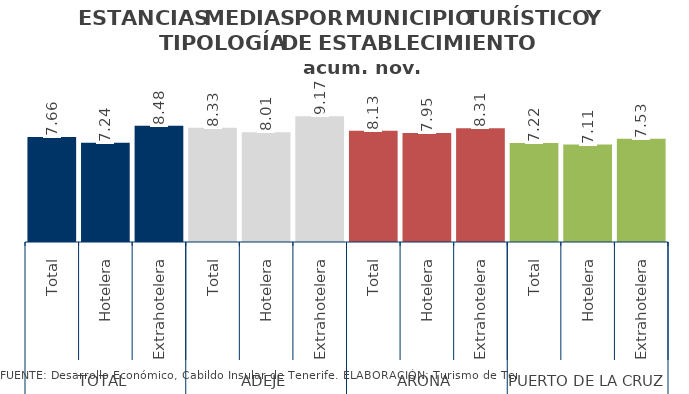
| Category | Series 2 |
|---|---|
| 0 | 7.663 |
| 1 | 7.243 |
| 2 | 8.477 |
| 3 | 8.333 |
| 4 | 8.013 |
| 5 | 9.174 |
| 6 | 8.126 |
| 7 | 7.953 |
| 8 | 8.305 |
| 9 | 7.224 |
| 10 | 7.111 |
| 11 | 7.528 |